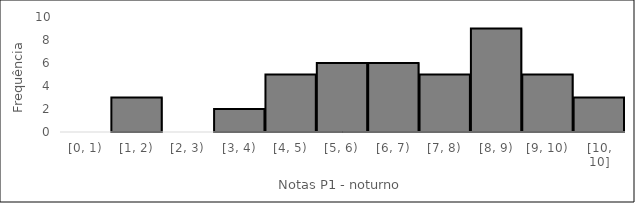
| Category | Freq. |
|---|---|
| [0, 1) | 0 |
| [1, 2) | 3 |
| [2, 3) | 0 |
| [3, 4) | 2 |
| [4, 5) | 5 |
| [5, 6) | 6 |
| [6, 7) | 6 |
| [7, 8) | 5 |
| [8, 9) | 9 |
| [9, 10) | 5 |
| [10, 10] | 3 |